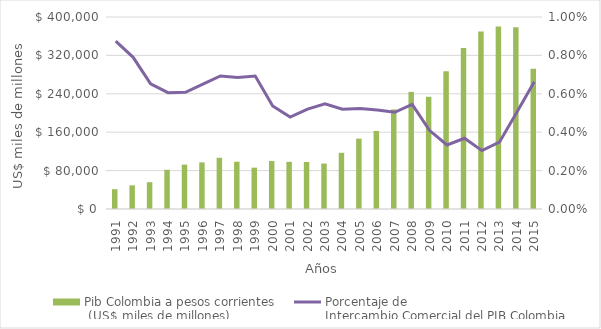
| Category | Pib Colombia a pesos corrientes
 (US$ miles de millones) |
|---|---|
| 1991.0 | 41239.551 |
| 1992.0 | 49279.585 |
| 1993.0 | 55802.54 |
| 1994.0 | 81703.497 |
| 1995.0 | 92507.278 |
| 1996.0 | 97160.112 |
| 1997.0 | 106659.508 |
| 1998.0 | 98443.743 |
| 1999.0 | 86186.157 |
| 2000.0 | 99886.578 |
| 2001.0 | 98203.545 |
| 2002.0 | 97933.392 |
| 2003.0 | 94684.583 |
| 2004.0 | 117074.866 |
| 2005.0 | 146566.266 |
| 2006.0 | 162590.146 |
| 2007.0 | 207416.495 |
| 2008.0 | 243982.438 |
| 2009.0 | 233821.671 |
| 2010.0 | 287018.185 |
| 2011.0 | 335415.157 |
| 2012.0 | 369659.7 |
| 2013.0 | 380191.882 |
| 2014.0 | 378416.021 |
| 2015.0 | 292080.156 |